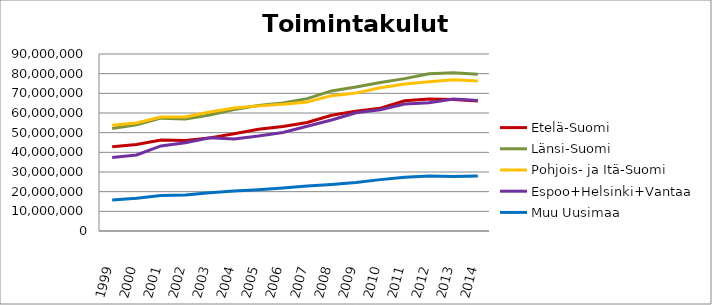
| Category | Etelä-Suomi | Länsi-Suomi | Pohjois- ja Itä-Suomi | Espoo+Helsinki+Vantaa | Muu Uusimaa |
|---|---|---|---|---|---|
| 1999.0 | 42832526.72 | 52150984.17 | 53807645.36 | 37409869.11 | 15729733.9 |
| 2000.0 | 44005755.95 | 53957387.63 | 54890797.17 | 38636130.46 | 16635299.58 |
| 2001.0 | 46301684.79 | 57385138.41 | 57948696.22 | 43246613.79 | 18054146.91 |
| 2002.0 | 45991324 | 56928210 | 58013324 | 44895814 | 18286507 |
| 2003.0 | 47348911 | 58966787 | 60499885 | 47412293 | 19507935 |
| 2004.0 | 49438831 | 61804218 | 62537906 | 46793169 | 20344418 |
| 2005.0 | 51757715 | 63821411 | 63623010 | 48297936 | 20973655 |
| 2006.0 | 53165773 | 65071935 | 64456210 | 50127274 | 21870798 |
| 2007.0 | 55166747 | 67293322 | 65629361 | 53251493 | 22911953 |
| 2008.0 | 58858383.2 | 71218395.17 | 68828152.31 | 56462387 | 23641895 |
| 2009.0 | 60952127.66 | 73204893.39 | 70115396.9 | 60155501.92 | 24630638.99 |
| 2010.0 | 62412081.64 | 75497137.35 | 72835803.54 | 61634501.17 | 26121944.06 |
| 2011.0 | 66220055.25 | 77480788.87 | 74710727.89 | 64609536.75 | 27284660.48 |
| 2012.0 | 67160242.33 | 79915019.23 | 75835999.72 | 65186436.73 | 27940483.01 |
| 2013.0 | 66840900.27 | 80493594.09 | 76903187.31 | 67084377.84 | 27739472 |
| 2014.0 | 66102470.18 | 79648418.75 | 76273907.88 | 66409478.55 | 27996232.4 |